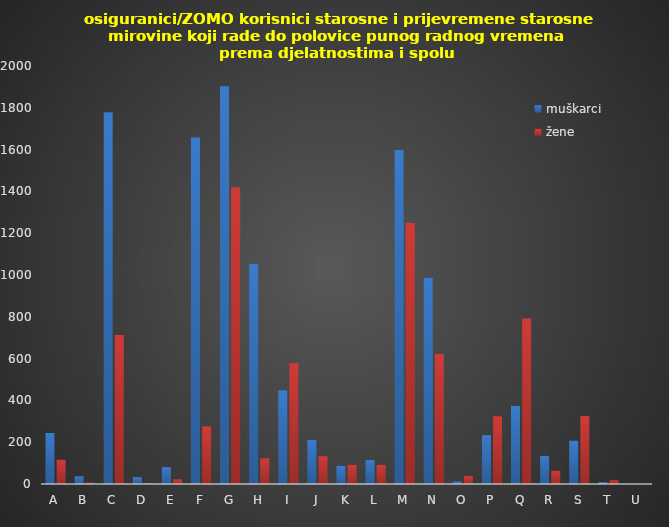
| Category | muškarci | žene |
|---|---|---|
| A | 244 | 117 |
| B | 37 | 7 |
| C | 1779 | 713 |
| D | 33 | 3 |
| E | 81 | 22 |
| F | 1658 | 276 |
| G | 1903 | 1420 |
| H | 1054 | 123 |
| I | 448 | 578 |
| J | 211 | 133 |
| K | 87 | 92 |
| L | 115 | 92 |
| M | 1598 | 1249 |
| N | 988 | 623 |
| O | 12 | 39 |
| P | 234 | 324 |
| Q | 374 | 792 |
| R | 135 | 64 |
| S | 208 | 326 |
| T | 9 | 18 |
| U | 0 | 0 |